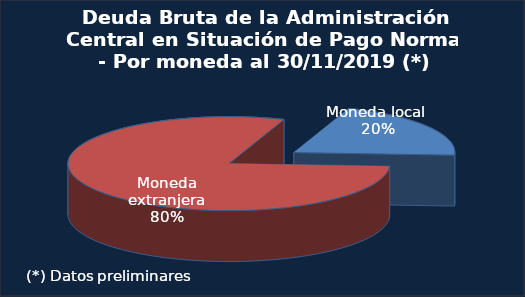
| Category | Series 0 |
|---|---|
| Moneda local (1) | 0.203 |
| Moneda extranjera | 0.797 |